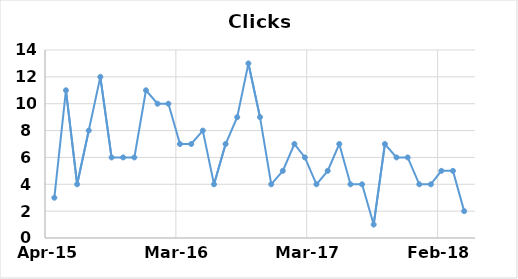
| Category | Series 0 |
|---|---|
| 42125.0 | 3 |
| 42156.0 | 11 |
| 42186.0 | 4 |
| 42217.0 | 8 |
| 42248.0 | 12 |
| 42278.0 | 6 |
| 42309.0 | 6 |
| 42339.0 | 6 |
| 42370.0 | 11 |
| 42401.0 | 10 |
| 42430.0 | 10 |
| 42461.0 | 7 |
| 42491.0 | 7 |
| 42522.0 | 8 |
| 42552.0 | 4 |
| 42583.0 | 7 |
| 42614.0 | 9 |
| 42644.0 | 13 |
| 42675.0 | 9 |
| 42705.0 | 4 |
| 42736.0 | 5 |
| 42767.0 | 7 |
| 42795.0 | 6 |
| 42826.0 | 4 |
| 42856.0 | 5 |
| 42887.0 | 7 |
| 42917.0 | 4 |
| 42948.0 | 4 |
| 42979.0 | 1 |
| 43009.0 | 7 |
| 43040.0 | 6 |
| 43070.0 | 6 |
| 43101.0 | 4 |
| 43132.0 | 4 |
| 43160.0 | 5 |
| 43191.0 | 5 |
| 43221.0 | 2 |